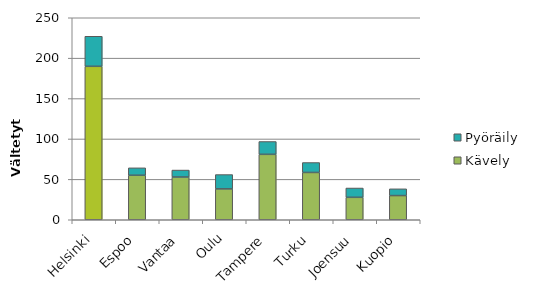
| Category | Kävely | Pyöräily |
|---|---|---|
| Helsinki | 189.897 | 37.191 |
| Espoo | 55.06 | 9.186 |
| Vantaa | 52.853 | 8.655 |
| Oulu | 38.184 | 17.749 |
| Tampere | 80.95 | 15.888 |
| Turku | 58.523 | 12.305 |
| Joensuu | 27.759 | 11.528 |
| Kuopio | 29.934 | 8.337 |